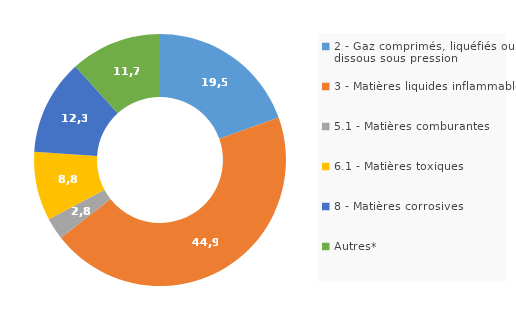
| Category | Series 0 |
|---|---|
| 2 - Gaz comprimés, liquéfiés ou dissous sous pression | 19.536 |
| 3 - Matières liquides inflammables | 44.87 |
| 5.1 - Matières comburantes | 2.801 |
| 6.1 - Matières toxiques | 8.826 |
| 8 - Matières corrosives | 12.261 |
| Autres* | 11.705 |